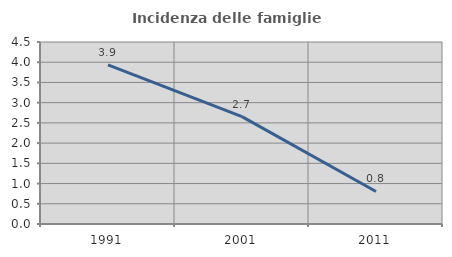
| Category | Incidenza delle famiglie numerose |
|---|---|
| 1991.0 | 3.934 |
| 2001.0 | 2.655 |
| 2011.0 | 0.804 |